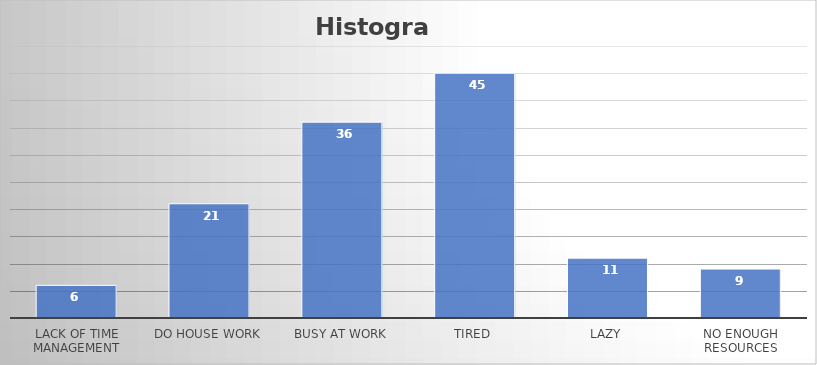
| Category | Error- Deffect- Problem |
|---|---|
| Lack of time management | 6 |
| Do house work | 21 |
| Busy at Work | 36 |
| Tired | 45 |
| Lazy | 11 |
| No enough resources | 9 |